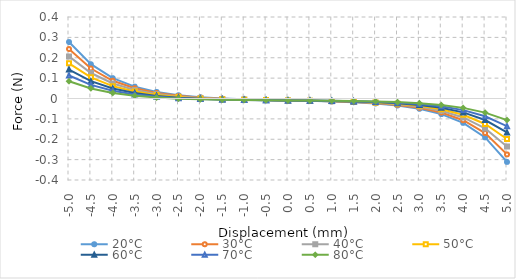
| Category | 20°C | 30°C | 40°C | 50°C | 60°C | 70°C | 80°C |
|---|---|---|---|---|---|---|---|
| -5.0 | 0.277 | 0.243 | 0.207 | 0.172 | 0.142 | 0.113 | 0.085 |
| -4.5 | 0.168 | 0.147 | 0.125 | 0.104 | 0.085 | 0.067 | 0.049 |
| -4.0 | 0.1 | 0.087 | 0.074 | 0.061 | 0.049 | 0.038 | 0.027 |
| -3.5 | 0.058 | 0.05 | 0.042 | 0.034 | 0.027 | 0.02 | 0.013 |
| -3.0 | 0.032 | 0.027 | 0.022 | 0.017 | 0.013 | 0.009 | 0.005 |
| -2.5 | 0.016 | 0.013 | 0.01 | 0.007 | 0.004 | 0.002 | -0.001 |
| -2.0 | 0.006 | 0.004 | 0.002 | 0.001 | -0.001 | -0.003 | -0.004 |
| -1.5 | 0 | -0.001 | -0.002 | -0.003 | -0.004 | -0.005 | -0.006 |
| -1.0 | -0.004 | -0.005 | -0.005 | -0.006 | -0.007 | -0.007 | -0.008 |
| -0.5 | -0.007 | -0.007 | -0.008 | -0.008 | -0.008 | -0.008 | -0.008 |
| 0.0 | -0.009 | -0.009 | -0.009 | -0.009 | -0.009 | -0.009 | -0.009 |
| 0.5 | -0.012 | -0.011 | -0.011 | -0.011 | -0.01 | -0.01 | -0.01 |
| 1.0 | -0.014 | -0.014 | -0.013 | -0.012 | -0.012 | -0.011 | -0.011 |
| 1.5 | -0.018 | -0.017 | -0.016 | -0.015 | -0.014 | -0.013 | -0.012 |
| 2.0 | -0.024 | -0.023 | -0.021 | -0.019 | -0.017 | -0.016 | -0.014 |
| 2.5 | -0.034 | -0.032 | -0.028 | -0.025 | -0.023 | -0.02 | -0.018 |
| 3.0 | -0.05 | -0.046 | -0.041 | -0.036 | -0.031 | -0.027 | -0.023 |
| 3.5 | -0.077 | -0.069 | -0.06 | -0.052 | -0.045 | -0.038 | -0.032 |
| 4.0 | -0.12 | -0.107 | -0.093 | -0.08 | -0.068 | -0.057 | -0.046 |
| 4.5 | -0.191 | -0.169 | -0.147 | -0.125 | -0.106 | -0.087 | -0.069 |
| 5.0 | -0.311 | -0.274 | -0.236 | -0.199 | -0.167 | -0.136 | -0.106 |